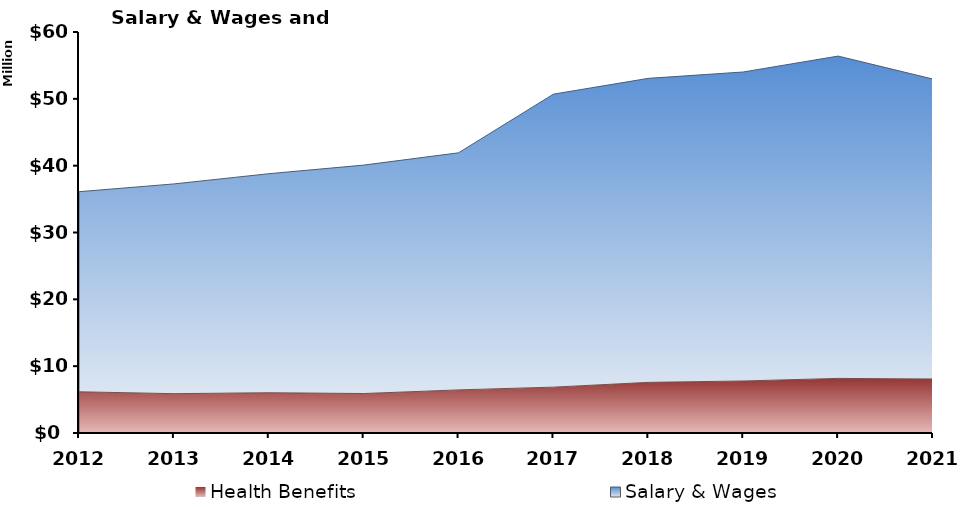
| Category | Health Benefits | Salary & Wages |
|---|---|---|
| 2012.0 | 6165810 | 29938031 |
| 2013.0 | 5883187 | 31383687 |
| 2014.0 | 6024948 | 32769209 |
| 2015.0 | 5904061 | 34180178 |
| 2016.0 | 6450000 | 35471107 |
| 2017.0 | 6861325 | 43842289 |
| 2018.0 | 7576290 | 45486226 |
| 2019.0 | 7782708 | 46234221 |
| 2020.0 | 8170942 | 48225508 |
| 2021.0 | 8080414 | 44871000 |